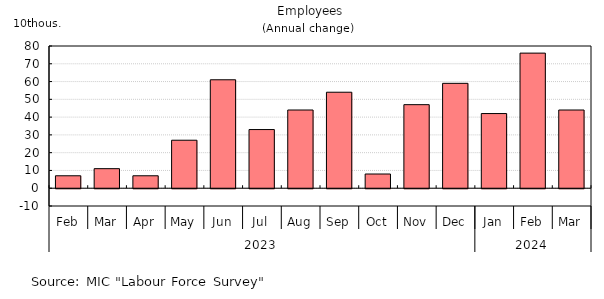
| Category | Series 0 |
|---|---|
| 0 | 7 |
| 1 | 11 |
| 2 | 7 |
| 3 | 27 |
| 4 | 61 |
| 5 | 33 |
| 6 | 44 |
| 7 | 54 |
| 8 | 8 |
| 9 | 47 |
| 10 | 59 |
| 11 | 42 |
| 12 | 76 |
| 13 | 44 |